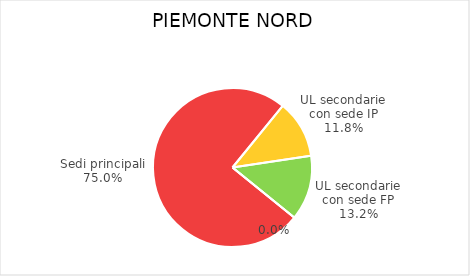
| Category | Piemonte Nord |
|---|---|
| Sedi principali | 40537 |
| UL secondarie con sede IP | 6357 |
| UL secondarie con sede FP | 7130 |